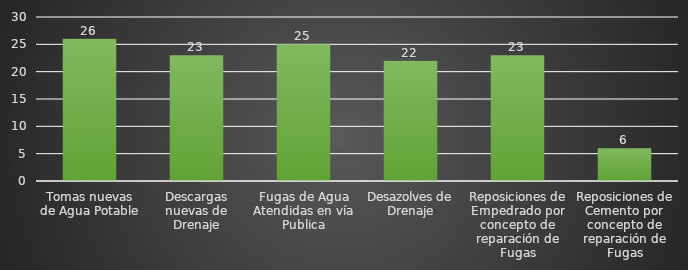
| Category | INDICADOR  |
|---|---|
| Tomas nuevas de Agua Potable | 26 |
| Descargas nuevas de Drenaje | 23 |
| Fugas de Agua Atendidas en vía Publica | 25 |
| Desazolves de Drenaje | 22 |
| Reposiciones de Empedrado por concepto de reparación de Fugas | 23 |
| Reposiciones de Cemento por concepto de reparación de Fugas | 6 |